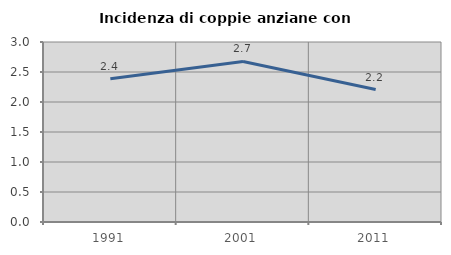
| Category | Incidenza di coppie anziane con figli |
|---|---|
| 1991.0 | 2.388 |
| 2001.0 | 2.676 |
| 2011.0 | 2.208 |